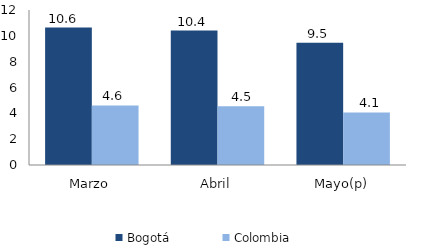
| Category | Bogotá | Colombia |
|---|---|---|
| Marzo | 10.636 | 4.613 |
| Abril | 10.409 | 4.541 |
| Mayo(p) | 9.455 | 4.071 |